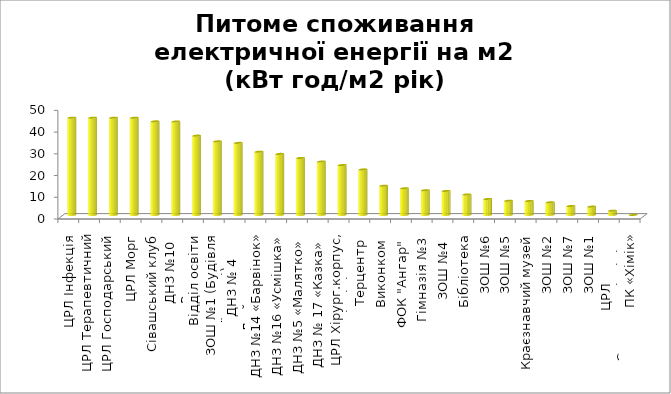
| Category | Питоме споживання електричної енергії на м2
(кВт год/м2 рік) |
|---|---|
| ЦРЛ Інфекція | 44.781 |
| ЦРЛ Терапевтичний корпус | 44.781 |
| ЦРЛ Господарський корпус | 44.781 |
| ЦРЛ Морг | 44.781 |
| Сівашський клуб | 43.096 |
| ДНЗ №10 «Ромашка» | 43.034 |
| Відділ освіти | 36.526 |
| ЗОШ №1 (Будівля їдальні) | 33.892 |
| ДНЗ № 4 «Дюймовочка»
 | 33.192 |
| ДНЗ №14 «Барвінок»  | 29.126 |
| ДНЗ №16 «Усмішка» | 28.117 |
| ДНЗ №5 «Малятко»  | 26.248 |
| ДНЗ № 17 «Казка»  | 24.602 |
| ЦРЛ Хірург.корпус, поліклініка | 22.989 |
| Терцентр  | 20.971 |
| Виконком  | 13.462 |
| ФОК "Ангар"  | 12.316 |
| Гімназія №3  | 11.388 |
| ЗОШ №4 
 | 11.063 |
| Бібліотека | 9.457 |
| ЗОШ №6 | 7.384 |
| ЗОШ №5 | 6.555 |
| Краєзнавчий музей | 6.462 |
| ЗОШ №2 | 5.839 |
| ЗОШ №7 | 4.148 |
| ЗОШ №1 | 3.862 |
| ЦРЛ Стоматполіклініка | 1.977 |
| ПК «Хімік» | 0.051 |